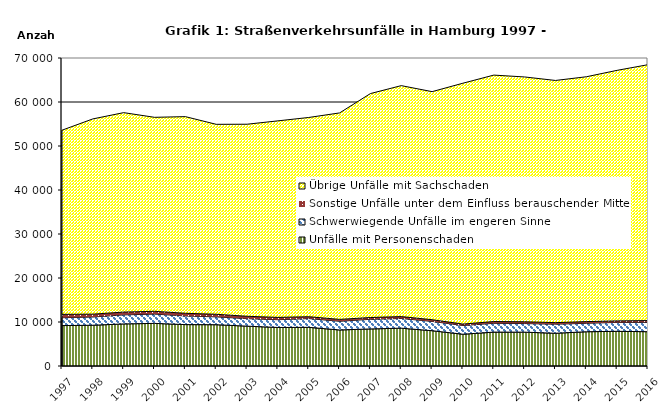
| Category | Unfälle mit Personenschaden | Schwerwiegende Unfälle im engeren Sinne | Sonstige Unfälle unter dem Einfluss berauschender Mittel 1) | Übrige Unfälle mit Sachschaden |
|---|---|---|---|---|
| 1997.0 | 9186 | 1789 | 763 | 41852 |
| 1998.0 | 9264 | 1869 | 648 | 44374 |
| 1999.0 | 9566 | 2055 | 634 | 45326 |
| 2000.0 | 9684 | 2114 | 632 | 44087 |
| 2001.0 | 9410 | 1972 | 596 | 44696 |
| 2002.0 | 9383 | 1782 | 592 | 43169 |
| 2003.0 | 9058 | 1702 | 542 | 43646 |
| 2004.0 | 8755 | 1770 | 513 | 44673 |
| 2005.0 | 8788 | 1991 | 422 | 45281 |
| 2006.0 | 8190 | 1977 | 424 | 46926 |
| 2007.0 | 8426 | 2186 | 404 | 50897 |
| 2008.0 | 8594 | 2206 | 432 | 52488 |
| 2009.0 | 8022 | 2115 | 380 | 51835 |
| 2010.0 | 7217 | 1987 | 324 | 54741 |
| 2011.0 | 7704 | 2003 | 394 | 56014 |
| 2012.0 | 7691 | 1958 | 401 | 55640 |
| 2013.0 | 7443 | 2059 | 355 | 55040 |
| 2014.0 | 7787 | 1921 | 380 | 55646 |
| 2015.0 | 7881 | 2030 | 341 | 56944 |
| 2016.0 | 7795 | 2138 | 392 | 58152 |